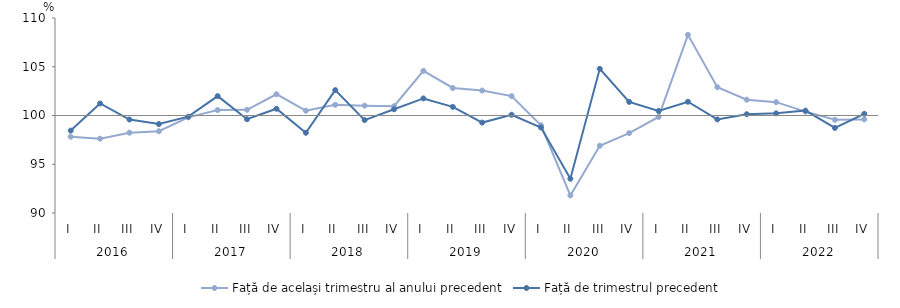
| Category | Față de același trimestru al anului precedent | Față de trimestrul precedent |
|---|---|---|
| 0 | 97.825 | 98.452 |
| 1 | 97.621 | 101.233 |
| 2 | 98.239 | 99.588 |
| 3 | 98.385 | 99.123 |
| 4 | 99.811 | 99.879 |
| 5 | 100.556 | 101.989 |
| 6 | 100.586 | 99.618 |
| 7 | 102.179 | 100.693 |
| 8 | 100.491 | 98.228 |
| 9 | 101.097 | 102.604 |
| 10 | 101.008 | 99.53 |
| 11 | 100.954 | 100.639 |
| 12 | 104.574 | 101.751 |
| 13 | 102.823 | 100.886 |
| 14 | 102.56 | 99.275 |
| 15 | 101.986 | 100.076 |
| 16 | 99 | 98.772 |
| 17 | 91.8 | 93.516 |
| 18 | 96.9 | 104.788 |
| 19 | 98.2 | 101.4 |
| 20 | 99.847 | 100.472 |
| 21 | 108.274 | 101.409 |
| 22 | 102.9 | 99.6 |
| 23 | 101.623 | 100.13 |
| 24 | 101.369 | 100.22 |
| 25 | 100.4 | 100.5 |
| 26 | 99.559 | 98.729 |
| 27 | 99.601 | 100.173 |